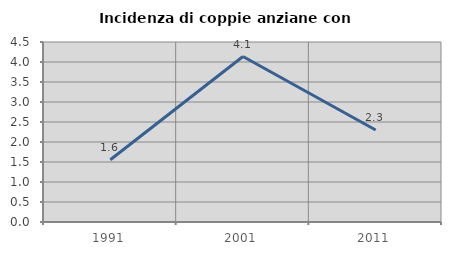
| Category | Incidenza di coppie anziane con figli |
|---|---|
| 1991.0 | 1.556 |
| 2001.0 | 4.137 |
| 2011.0 | 2.301 |